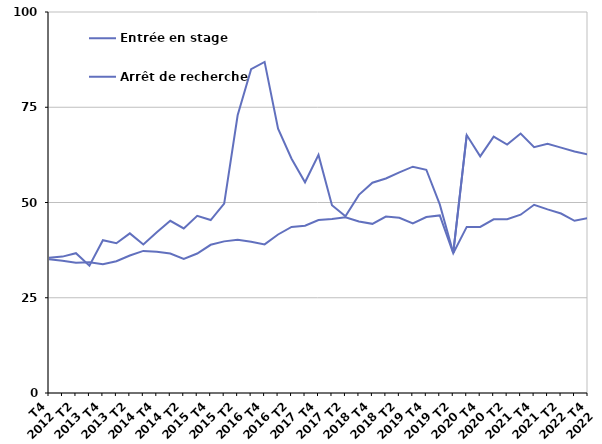
| Category | Entrée en stage | Arrêt de recherche |
|---|---|---|
| T4
2012 | 35.5 | 35.1 |
| T1
2013 | 35.8 | 34.7 |
| T2
2013 | 36.7 | 34.2 |
| T3
2013 | 33.4 | 34.3 |
| T4
2013 | 40.1 | 33.8 |
| T1
2014 | 39.3 | 34.6 |
| T2
2014 | 41.9 | 36.1 |
| T3
2014 | 39 | 37.3 |
| T4
2014 | 42.2 | 37.1 |
| T1
2015 | 45.2 | 36.6 |
| T2
2015 | 43.2 | 35.2 |
| T3
2015 | 46.5 | 36.6 |
| T4
2015 | 45.4 | 38.9 |
| T1
2016 | 49.7 | 39.8 |
| T2
2016 | 72.9 | 40.2 |
| T3
2016 | 85 | 39.7 |
| T4
2016 | 86.9 | 39 |
| T1
2017 | 69.4 | 41.6 |
| T2
2017 | 61.5 | 43.6 |
| T3
2017 | 55.3 | 43.9 |
| T4
2017 | 62.5 | 45.4 |
| T1
2018 | 49.3 | 45.7 |
| T2
2018 | 46.4 | 46.1 |
| T3
2018 | 52 | 45 |
| T4
2018 | 55.2 | 44.4 |
| T1
2019 | 56.3 | 46.3 |
| T2
2019 | 57.9 | 46 |
| T3
2019 | 59.4 | 44.5 |
| T4
2019 | 58.6 | 46.2 |
| T1
2020 | 49.5 | 46.6 |
| T2
2020 | 36.8 | 36.7 |
| T3
2020 | 67.7 | 43.6 |
| T4
2020 | 62.1 | 43.6 |
| T1
2021 | 67.3 | 45.6 |
| T2
2021 | 65.2 | 45.6 |
| T3
2021 | 68.1 | 46.8 |
| T4
2021 | 64.5 | 49.4 |
| T1
2022 | 65.4 | 48.2 |
| T2
2022 | 64.4 | 47.1 |
| T3
2022 | 63.4 | 45.2 |
| T4
2022 | 62.6 | 45.9 |